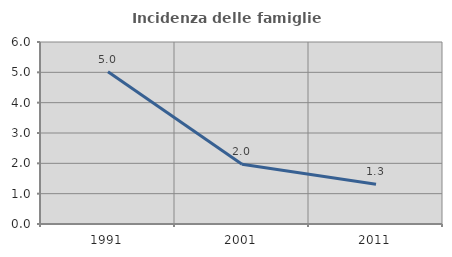
| Category | Incidenza delle famiglie numerose |
|---|---|
| 1991.0 | 5.021 |
| 2001.0 | 1.973 |
| 2011.0 | 1.309 |